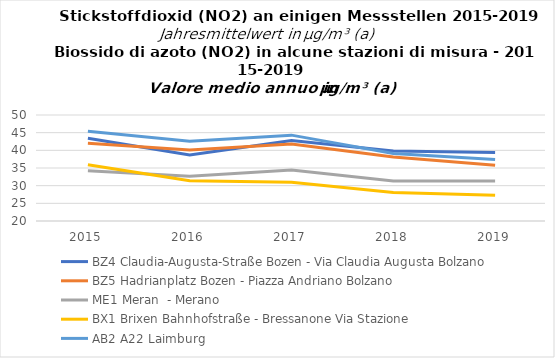
| Category | BZ4 Claudia-Augusta-Straße Bozen - Via Claudia Augusta Bolzano | BZ5 Hadrianplatz Bozen - Piazza Andriano Bolzano | ME1 Meran  - Merano | BX1 Brixen Bahnhofstraße - Bressanone Via Stazione  | AB2 A22 Laimburg |
|---|---|---|---|---|---|
| 2015.0 | 43.4 | 42 | 34.2 | 35.9 | 45.4 |
| 2016.0 | 38.7 | 40.1 | 32.7 | 31.4 | 42.6 |
| 2017.0 | 42.8 | 41.8 | 34.4 | 31 | 44.3 |
| 2018.0 | 39.8 | 38.1 | 31.3 | 28.1 | 39.1 |
| 2019.0 | 39.4 | 35.8 | 31.3 | 27.3 | 37.4 |